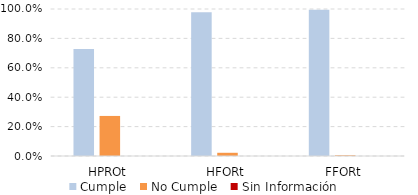
| Category | Cumple | No Cumple | Sin Información |
|---|---|---|---|
| HPROt | 0.727 | 0.273 | 0 |
| HFORt | 0.978 | 0.022 | 0 |
| FFORt | 0.995 | 0.005 | 0 |